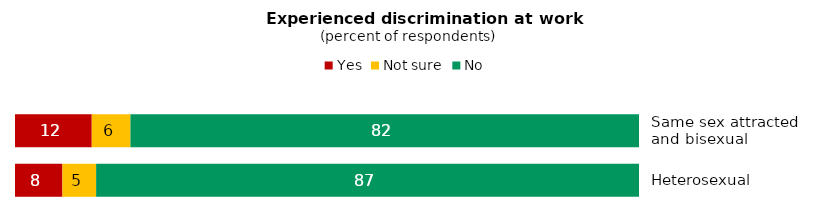
| Category | Yes | Not sure | No |
|---|---|---|---|
| Same sex attracted 
and bisexual | 12.3 | 6.2 | 81.5 |
| Heterosexual | 7.6 | 5.4 | 87 |